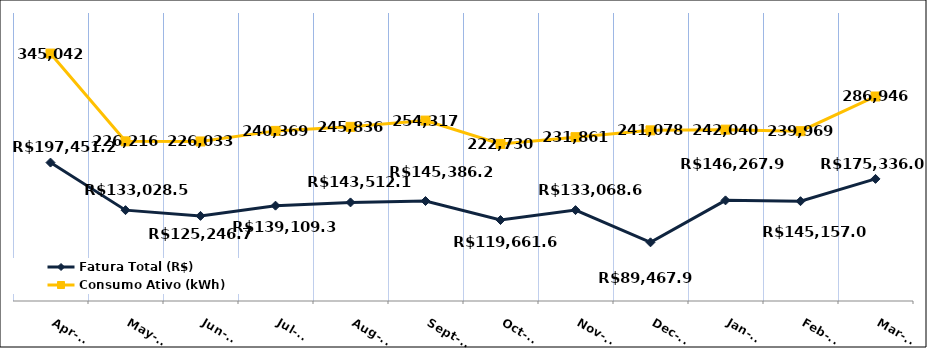
| Category | Fatura Total (R$) |
|---|---|
| 2023-04-01 | 197451.2 |
| 2023-05-01 | 133028.53 |
| 2023-06-01 | 125246.79 |
| 2023-07-01 | 139109.37 |
| 2023-08-01 | 143512.1 |
| 2023-09-01 | 145386.2 |
| 2023-10-01 | 119661.68 |
| 2023-11-01 | 133068.65 |
| 2023-12-01 | 89467.98 |
| 2024-01-01 | 146267.97 |
| 2024-02-01 | 145157.02 |
| 2024-03-01 | 175336 |